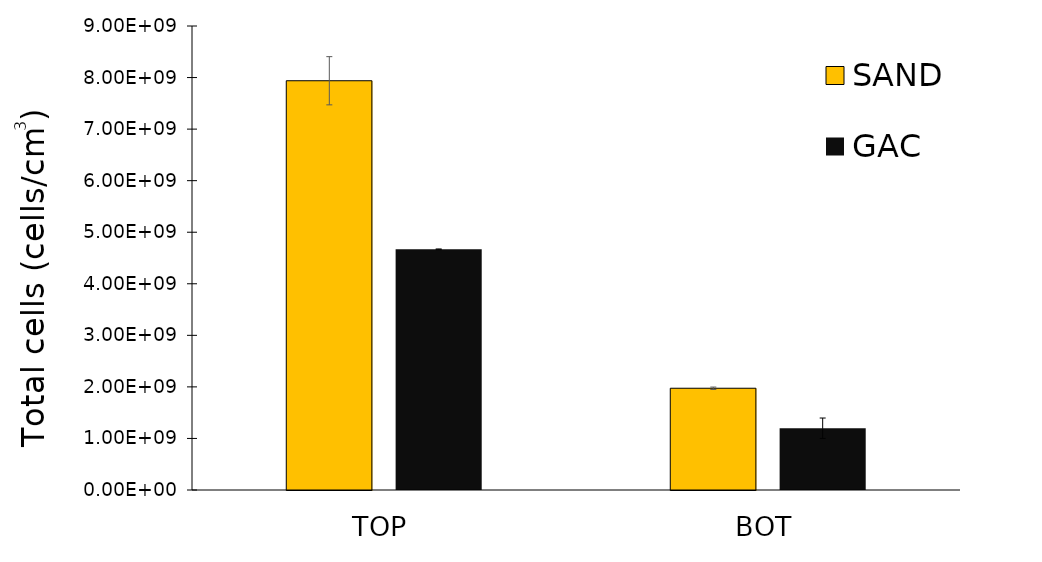
| Category | SAND | GAC |
|---|---|---|
| TOP | 7938065492.204 | 4668258082.371 |
| BOT | 1973629879.423 | 1198634343.214 |